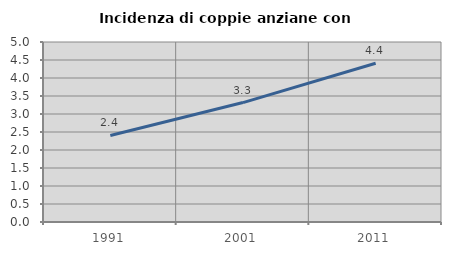
| Category | Incidenza di coppie anziane con figli |
|---|---|
| 1991.0 | 2.404 |
| 2001.0 | 3.317 |
| 2011.0 | 4.409 |